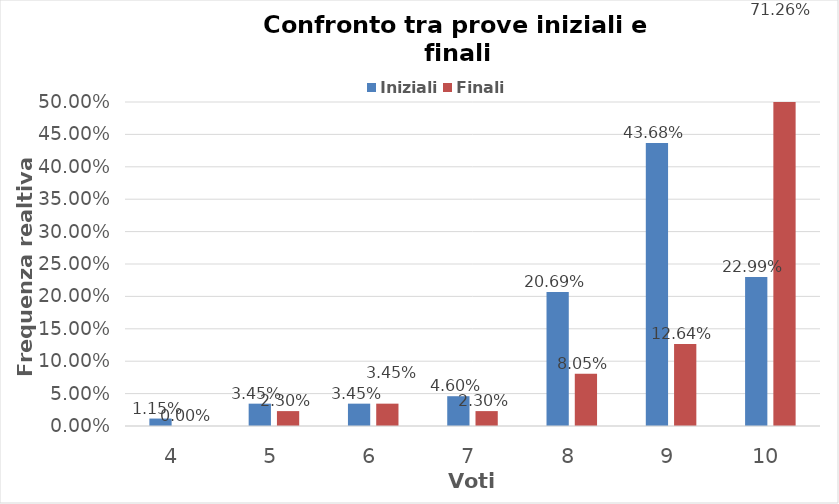
| Category | Iniziali | Finali |
|---|---|---|
| 4.0 | 0.011 | 0 |
| 5.0 | 0.034 | 0.023 |
| 6.0 | 0.034 | 0.034 |
| 7.0 | 0.046 | 0.023 |
| 8.0 | 0.207 | 0.08 |
| 9.0 | 0.437 | 0.126 |
| 10.0 | 0.23 | 0.713 |